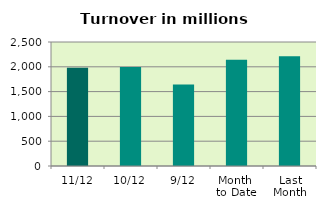
| Category | Series 0 |
|---|---|
| 11/12 | 1982.797 |
| 10/12 | 1994.123 |
| 9/12 | 1640.853 |
| Month 
to Date | 2142.584 |
| Last
Month | 2210.602 |